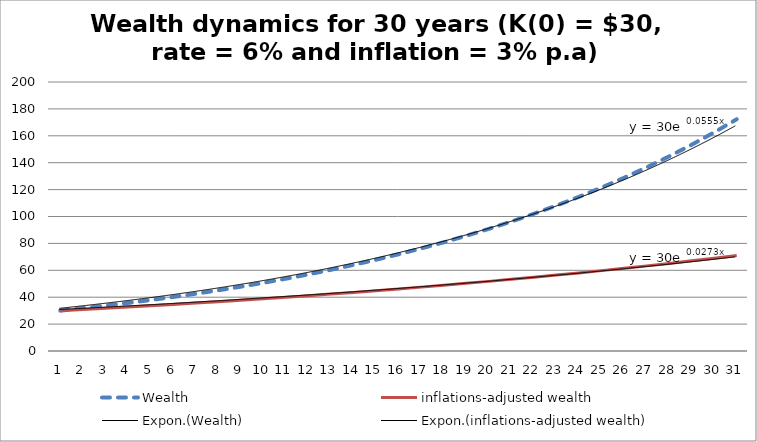
| Category | Wealth | inflations-adjusted wealth |
|---|---|---|
| 0 | 30 | 30 |
| 1 | 31.8 | 30.874 |
| 2 | 33.708 | 31.773 |
| 3 | 35.73 | 32.698 |
| 4 | 37.874 | 33.651 |
| 5 | 40.147 | 34.631 |
| 6 | 42.556 | 35.64 |
| 7 | 45.109 | 36.678 |
| 8 | 47.815 | 37.746 |
| 9 | 50.684 | 38.845 |
| 10 | 53.725 | 39.977 |
| 11 | 56.949 | 41.141 |
| 12 | 60.366 | 42.339 |
| 13 | 63.988 | 43.573 |
| 14 | 67.827 | 44.842 |
| 15 | 71.897 | 46.148 |
| 16 | 76.211 | 47.492 |
| 17 | 80.783 | 48.875 |
| 18 | 85.63 | 50.299 |
| 19 | 90.768 | 51.764 |
| 20 | 96.214 | 53.271 |
| 21 | 101.987 | 54.823 |
| 22 | 108.106 | 56.42 |
| 23 | 114.592 | 58.063 |
| 24 | 121.468 | 59.754 |
| 25 | 128.756 | 61.495 |
| 26 | 136.481 | 63.286 |
| 27 | 144.67 | 65.129 |
| 28 | 153.351 | 67.026 |
| 29 | 162.552 | 68.978 |
| 30 | 172.305 | 70.987 |